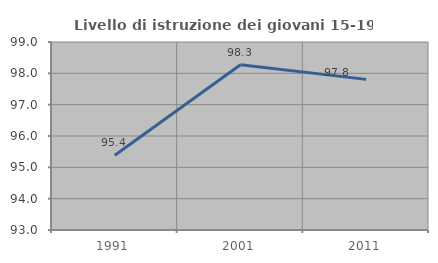
| Category | Livello di istruzione dei giovani 15-19 anni |
|---|---|
| 1991.0 | 95.387 |
| 2001.0 | 98.276 |
| 2011.0 | 97.807 |